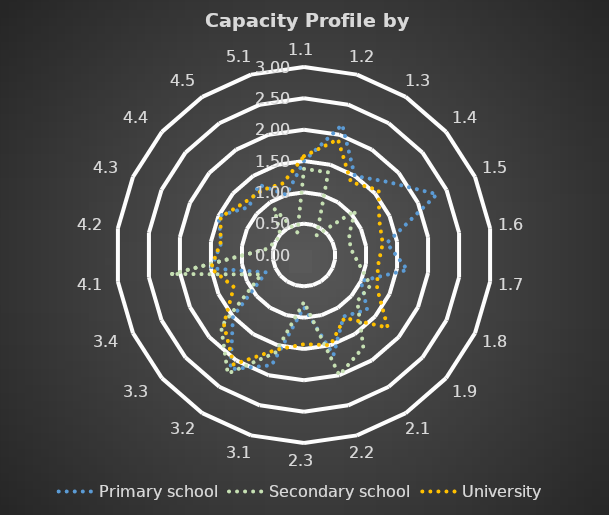
| Category | Primary school | Secondary school | University |
|---|---|---|---|
| 1.1 | 1.5 | 1.375 | 1.577 |
| 1.2 | 2.167 | 1.375 | 1.923 |
| 1.3 | 1.5 | 0.375 | 1.385 |
| 1.4 | 1.778 | 1.083 | 1.577 |
| 1.5 | 2.333 | 0.792 | 1.321 |
| 1.6 | 1.333 | 0.75 | 1.269 |
| 1.7 | 1.667 | 0.875 | 1.192 |
| 1.8 | 1 | 1.167 | 1.282 |
| 1.9 | 1.333 | 1.125 | 1.769 |
| 2.1 | 1.167 | 1.75 | 1.192 |
| 2.2 | 1.667 | 2 | 1.5 |
| 2.3 | 0.833 | 0.75 | 1.423 |
| 3.1 | 1.833 | 1.625 | 1.577 |
| 3.2 | 2.167 | 2.25 | 2.077 |
| 3.3 | 1.5 | 1.75 | 1.692 |
| 3.4 | 0.667 | 0.75 | 1.231 |
| 4.1 | 1.5 | 2.125 | 1.5 |
| 4.2 | 1.333 | 0.625 | 1.346 |
| 4.3 | 1.5 | 0.5 | 1.462 |
| 4.4 | 1.167 | 0.5 | 1.269 |
| 4.5 | 1.333 | 0.875 | 1.231 |
| 5.1 | 1 | 0.375 | 1.192 |